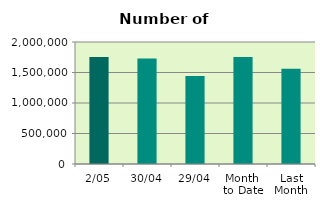
| Category | Series 0 |
|---|---|
| 2/05 | 1754742 |
| 30/04 | 1730970 |
| 29/04 | 1440748 |
| Month 
to Date | 1754742 |
| Last
Month | 1561575.6 |